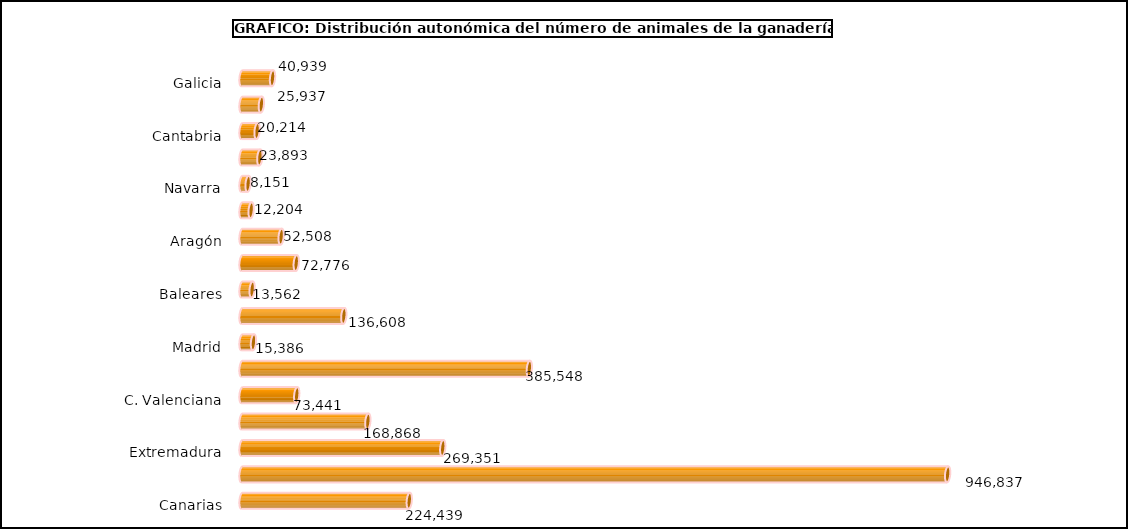
| Category | num. Animales |
|---|---|
|   Galicia | 40939 |
|   P. de Asturias | 25937 |
|   Cantabria | 20214 |
|   País Vasco | 23893 |
|   Navarra | 8151 |
|   La Rioja | 12204 |
|   Aragón | 52508 |
|   Cataluña | 72776 |
|   Baleares | 13562 |
|   Castilla y León | 136608 |
|   Madrid | 15386 |
|   Castilla – La Mancha | 385548 |
|   C. Valenciana | 73441 |
|   R. de Murcia | 168868 |
|   Extremadura | 269351 |
|   Andalucía | 946837 |
|   Canarias | 224439 |